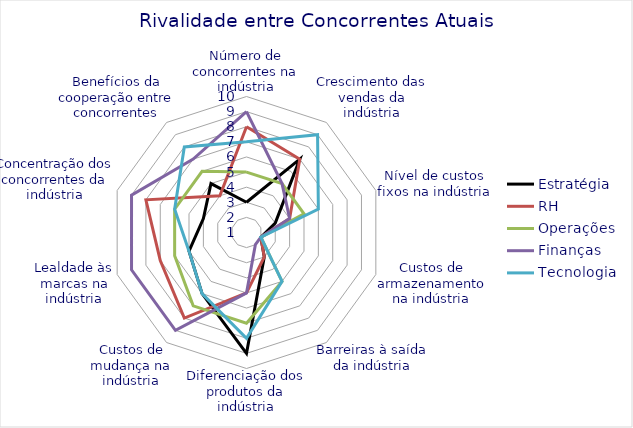
| Category | Estratégia | RH | Operações | Finanças | Tecnologia |
|---|---|---|---|---|---|
| Número de concorrentes na indústria | 3 | 8 | 5 | 9 | 7 |
| Crescimento das vendas da indústria | 7 | 7 | 5 | 5 | 9 |
| Nível de custos fixos na indústria | 3 | 4 | 5 | 4 | 6 |
| Custos de armazenamento na indústria | 2 | 2 | 2 | 2 | 2 |
| Barreiras à saída da indústria | 3 | 3 | 5 | 2 | 5 |
| Diferenciação dos produtos da indústria | 9 | 5 | 7 | 5 | 8 |
| Custos de mudança na indústria | 6 | 8 | 7 | 9 | 6 |
| Lealdade às marcas na indústria | 5 | 7 | 6 | 9 | 5 |
| Concentração dos concorrentes da indústria | 4 | 8 | 6 | 9 | 6 |
| Benefícios da cooperação entre concorrentes | 5 | 4 | 6 | 7 | 8 |